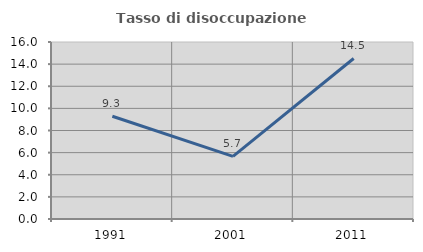
| Category | Tasso di disoccupazione giovanile  |
|---|---|
| 1991.0 | 9.289 |
| 2001.0 | 5.655 |
| 2011.0 | 14.51 |